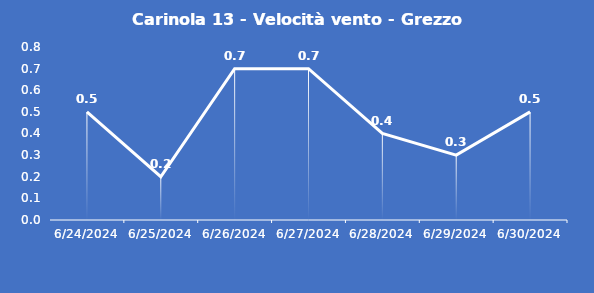
| Category | Carinola 13 - Velocità vento - Grezzo (m/s) |
|---|---|
| 6/24/24 | 0.5 |
| 6/25/24 | 0.2 |
| 6/26/24 | 0.7 |
| 6/27/24 | 0.7 |
| 6/28/24 | 0.4 |
| 6/29/24 | 0.3 |
| 6/30/24 | 0.5 |